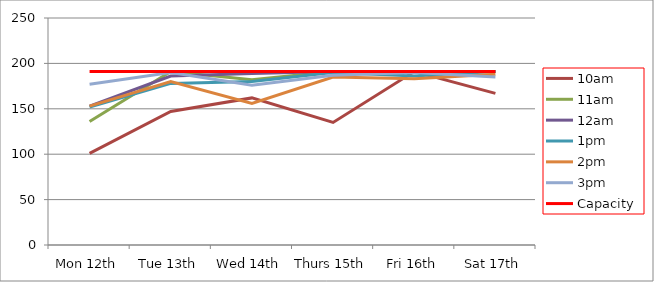
| Category | 9am | 10am | 11am | 12am | 1pm | 2pm | 3pm | 4pm | 5pm | Capacity |
|---|---|---|---|---|---|---|---|---|---|---|
| Mon 12th |  | 101 | 136 | 153 | 152 | 153 | 177 |  |  | 191 |
| Tue 13th |  | 147 | 191 | 186 | 178 | 180 | 190 |  |  | 191 |
| Wed 14th |  | 162 | 182 | 189 | 180 | 156 | 176 |  |  | 191 |
| Thurs 15th |  | 135 | 191 | 191 | 190 | 185 | 187 |  |  | 191 |
| Fri 16th |  | 191 | 191 | 191 | 186 | 183 | 190 |  |  | 191 |
| Sat 17th |  | 167 | 191 | 191 | 191 | 188 | 185 |  |  | 191 |